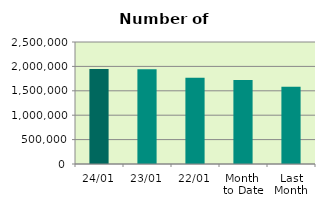
| Category | Series 0 |
|---|---|
| 24/01 | 1944482 |
| 23/01 | 1940890 |
| 22/01 | 1765388 |
| Month 
to Date | 1723811.647 |
| Last
Month | 1583843.3 |